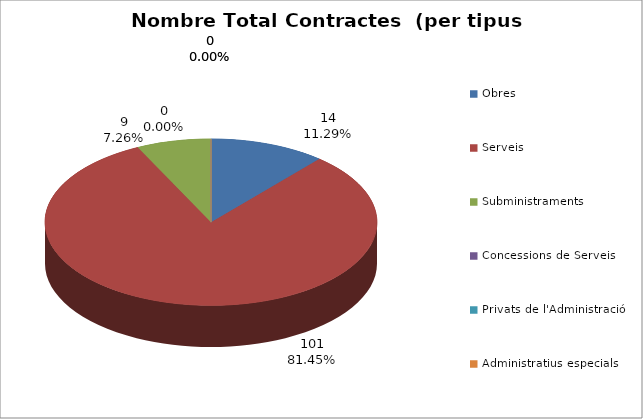
| Category | Nombre Total Contractes |
|---|---|
| Obres | 14 |
| Serveis | 101 |
| Subministraments | 9 |
| Concessions de Serveis | 0 |
| Privats de l'Administració | 0 |
| Administratius especials | 0 |